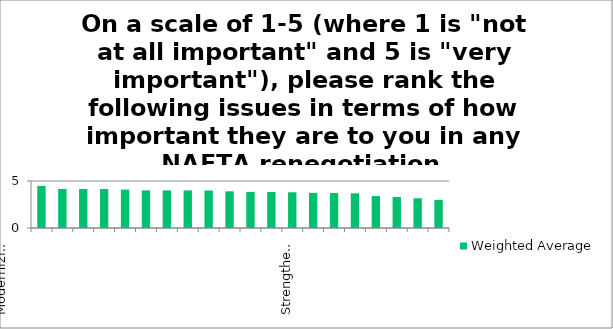
| Category | Weighted Average |
|---|---|
| Modernizing customs and border processing and controls | 4.48 |
| Strengthening provisions to defend against illegal subsidization and dumping of goods | 4.16 |
| Streamlining the movement of business professionals | 4.15 |
| Maintaining an effective and enforceable dispute-resolution mechanism within NAFTA | 4.15 |
| Expanding market access within NAFTA | 4.09 |
| Eliminating non-tariff barriers to trade (licensing requirements, etc.) | 4 |
| Improving the transparency and coordination of regulatory measures | 4 |
| Ensuring cross-border servicing of equipment and machinery by the original equipment manufacturer | 4 |
| Administering the assessment of the rules of origin in a clear and consistent manner? | 3.99 |
| Improving the recognition of educational equivalencies | 3.9 |
| Expanding the range of services covered under NAFTA | 3.84 |
| Ensuring reciprocal access to government procurement opportunities | 3.83 |
| Improving intellectual property protection and anti-counterfeiting measures | 3.8 |
| Expanding the list of NAFTA-exempt occupations permitted to work in signatory countries | 3.74 |
| Strengthening and enforcing labour and environmental obligations | 3.72 |
| Reducing barriers to digital trade in goods and services | 3.69 |
| Changing the NAFTA Rules of Origin qualifying rules | 3.4 |
| Preserving Canada’s system of supply management in dairy, poultry and eggs | 3.3 |
| Preserving Canada’s existing restrictions on foreign competition and investment in certain services industries (financial services, telecommunications, domestic airline services) | 3.16 |
| Eliminating other agricultural subsidies and protections | 3 |